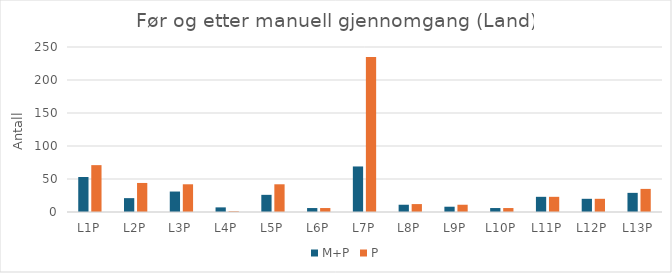
| Category | M+P | P |
|---|---|---|
| L1P | 53 | 71 |
| L2P | 21 | 44 |
| L3P | 31 | 42 |
| L4P | 7 | 1 |
| L5P | 26 | 42 |
| L6P | 6 | 6 |
| L7P | 69 | 235 |
| L8P | 11 | 12 |
| L9P | 8 | 11 |
| L10P | 6 | 6 |
| L11P | 23 | 23 |
| L12P | 20 | 20 |
| L13P | 29 | 35 |